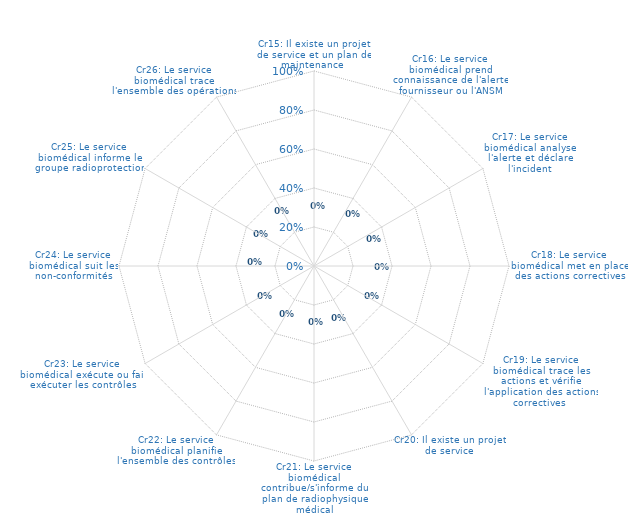
| Category | Cr15: Il existe un projet de service et un plan de maintenance  |
|---|---|
| Cr15: Il existe un projet de service et un plan de maintenance  | 0 |
| Cr16: Le service biomédical prend connaissance de l'alerte fournisseur ou l'ANSM | 0 |
| Cr17: Le service biomédical analyse l'alerte et déclare l'incident | 0 |
| Cr18: Le service biomédical met en place des actions correctives | 0 |
| Cr19: Le service biomédical trace les actions et vérifie l'application des actions correctives  | 0 |
| Cr20: Il existe un projet de service | 0 |
| Cr21: Le service biomédical contribue/s'informe du plan de radiophysique médical | 0 |
| Cr22: Le service biomédical planifie l'ensemble des contrôles | 0 |
| Cr23: Le service biomédical exécute ou fait exécuter les contrôles | 0 |
| Cr24: Le service biomédical suit les non-conformités | 0 |
| Cr25: Le service biomédical informe le groupe radioprotection | 0 |
| Cr26: Le service biomédical trace l'ensemble des opérations | 0 |